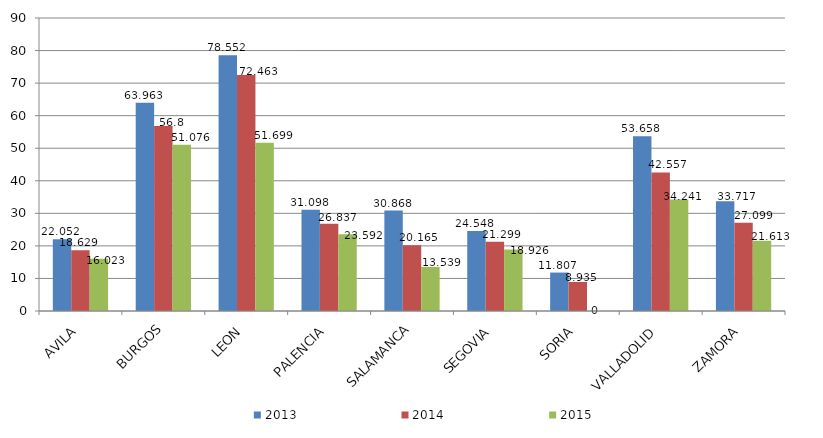
| Category | 2013 | 2014 | 2015 |
|---|---|---|---|
| AVILA | 22.052 | 18.629 | 16.023 |
| BURGOS | 63.963 | 56.8 | 51.076 |
| LEON | 78.552 | 72.463 | 51.699 |
| PALENCIA | 31.098 | 26.837 | 23.592 |
| SALAMANCA | 30.868 | 20.165 | 13.539 |
| SEGOVIA | 24.548 | 21.299 | 18.926 |
| SORIA | 11.807 | 8.935 | 0 |
| VALLADOLID | 53.658 | 42.557 | 34.241 |
| ZAMORA | 33.717 | 27.099 | 21.613 |